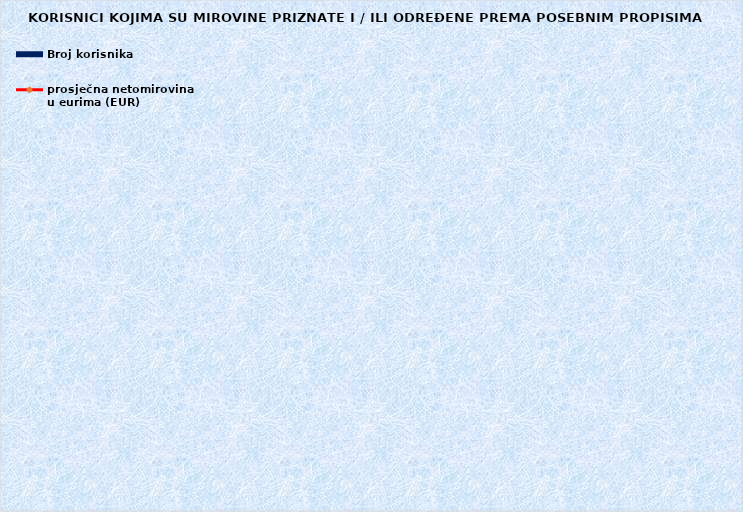
| Category | Broj korisnika |
|---|---|
|      a) radnici na poslovima ovlaštenih službenih osoba u tijelima unutarnjih 
poslova i pravosuđa, kojima je pravo na mirovinu priznato prema propisima
koji su bili na snazi do stupanja na snagu Zakona o pravima iz mirovinskog
osiguranja DVO, PS i OSO | 6933 |
|      b) radnici na  poslovima policijskih službenika, ovlaštenih službenih osoba pravosuđa i službene osobe s posebnim dužnostima i ovlastima u sigurnosno obavještajnom sustavu RH koji su pravo na mirovinu ostvarili prema Zakonu o pravima DVO, PS i OSO | 9622 |
|      c) radnici na poslovima razminiranja | 672 |
| Korisnici koji pravo na mirovinu ostvaruju prema Zakonu o vatrogastvu (NN 125/19)* | 376 |
| Djelatne vojne osobe - DVO  | 16125 |
| Pripadnici Hrvatske domovinske vojske od 1941. do 1945. godine | 1764 |
| Bivši politički zatvorenici | 2012 |
| Hrvatski branitelji iz Domovinskog rata - ZOHBDR | 71299 |
| Mirovine priznate prema općim propisima, a određene prema
ZOHBDR - u iz 2017. (čl. 27., 35., 48. i 49. stavak 2.)  | 58589 |
| Pripadnici bivše Jugoslavenske narodne armije - JNA | 3504 |
| Pripadnici bivše Jugoslavenske narodne armije - JNA - čl. 185 ZOMO | 153 |
| Sudionici Narodnooslobodilačkog rata - NOR | 4649 |
| Zastupnici u Hrvatskom saboru, članovi Vlade, suci Ustavnog suda i glavni državni revizor  | 679 |
| Članovi Izvršnog vijeća Sabora, Saveznog izvršnog vijeća i administrativno umirovljeni javni službenici | 62 |
| Bivši službenici u saveznim tijelima bivše SFRJ - članak 38. ZOMO | 17 |
| Redoviti članovi Hrvatske akademije znanosti i umjetnosti - HAZU | 119 |
| Radnici u Istarskim ugljenokopima "Tupljak" d.d. Labin  | 246 |
| Radnici profesionalno izloženi azbestu | 816 |
| Osiguranici - članovi posade broda u međunarodnoj plovidbi i nacionalnoj plovidbi - članak 129. a stavak 2. Pomorskog zakonika | 207 |
| Pripadnici Hrvatskog vijeća obrane  - HVO  | 6722 |